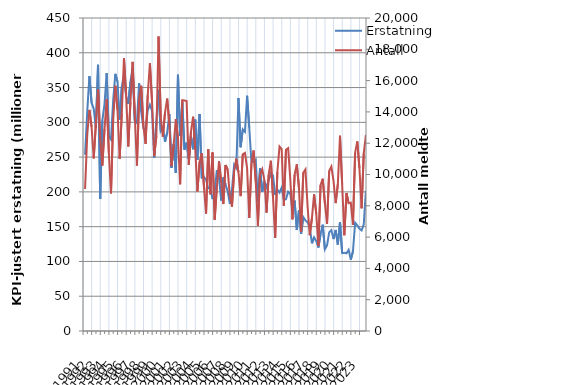
| Category | Erstatning |
|---|---|
| 1991.0 | 253.469 |
| nan | 315.36 |
| nan | 366.519 |
| nan | 328.269 |
| 1992.0 | 319.552 |
| nan | 291.981 |
| nan | 382.641 |
| nan | 189.775 |
| 1993.0 | 302.742 |
| nan | 326.193 |
| nan | 370.855 |
| nan | 280.025 |
| 1994.0 | 275.259 |
| nan | 331.438 |
| nan | 369.692 |
| nan | 358.663 |
| 1995.0 | 303.678 |
| nan | 351.299 |
| nan | 368.914 |
| nan | 337.816 |
| 1996.0 | 326.588 |
| nan | 358.519 |
| nan | 378.266 |
| nan | 302.415 |
| 1997.0 | 298.989 |
| nan | 356.113 |
| nan | 315.206 |
| nan | 291.396 |
| 1998.0 | 289.223 |
| nan | 317.273 |
| nan | 325.337 |
| nan | 316.584 |
| 1999.0 | 248.708 |
| nan | 301.782 |
| nan | 346.828 |
| nan | 287.664 |
| 2000.0 | 293.228 |
| nan | 271.936 |
| nan | 285.248 |
| nan | 311.846 |
| 2001.0 | 234.505 |
| nan | 268.968 |
| nan | 227.131 |
| nan | 368.386 |
| 2002.0 | 280.478 |
| nan | 328.826 |
| nan | 260.77 |
| nan | 270.739 |
| 2003.0 | 247.365 |
| nan | 280.296 |
| nan | 261.363 |
| nan | 303.899 |
| 2004.0 | 246.119 |
| nan | 312.001 |
| nan | 220.435 |
| nan | 221.355 |
| 2005.0 | 217.579 |
| nan | 205.064 |
| nan | 205.915 |
| nan | 189.628 |
| 2006.0 | 200.078 |
| nan | 231.376 |
| nan | 220.674 |
| nan | 187.581 |
| 2007.0 | 220.694 |
| nan | 210.821 |
| nan | 201.064 |
| nan | 183.119 |
| 2008.0 | 203.451 |
| nan | 239.218 |
| nan | 234.438 |
| nan | 334.908 |
| 2009.0 | 264.21 |
| nan | 289.974 |
| nan | 286.344 |
| nan | 338.202 |
| 2010.0 | 292.603 |
| nan | 242.276 |
| nan | 243.27 |
| nan | 246.171 |
| 2011.0 | 186.198 |
| nan | 233.898 |
| nan | 200.278 |
| nan | 214.975 |
| 2012.0 | 206.705 |
| nan | 216.668 |
| nan | 226.437 |
| nan | 223.463 |
| 2013.0 | 195.495 |
| nan | 203.199 |
| nan | 199.023 |
| nan | 206.2 |
| 2014.0 | 188.402 |
| nan | 189.607 |
| nan | 200.172 |
| nan | 197.056 |
| 2015.0 | 173.901 |
| nan | 187.368 |
| nan | 145.441 |
| nan | 173.337 |
| 2016.0 | 139.594 |
| nan | 163.833 |
| nan | 159.014 |
| nan | 156.137 |
| 2017.0 | 149.352 |
| nan | 126.055 |
| nan | 134.611 |
| nan | 129.438 |
| 2018.0 | 120.035 |
| nan | 139.312 |
| nan | 152.844 |
| nan | 117.524 |
| 2019.0 | 123.081 |
| nan | 141.817 |
| nan | 144.981 |
| nan | 132.183 |
| 2020.0 | 145.263 |
| nan | 124.327 |
| nan | 156.564 |
| nan | 111.962 |
| 2021.0 | 112.429 |
| nan | 111.632 |
| nan | 116.581 |
| nan | 102.588 |
| 2022.0 | 114.516 |
| nan | 155.702 |
| nan | 152.016 |
| nan | 147.103 |
| 2023.0 | 144.653 |
| nan | 153.305 |
| nan | 202.086 |